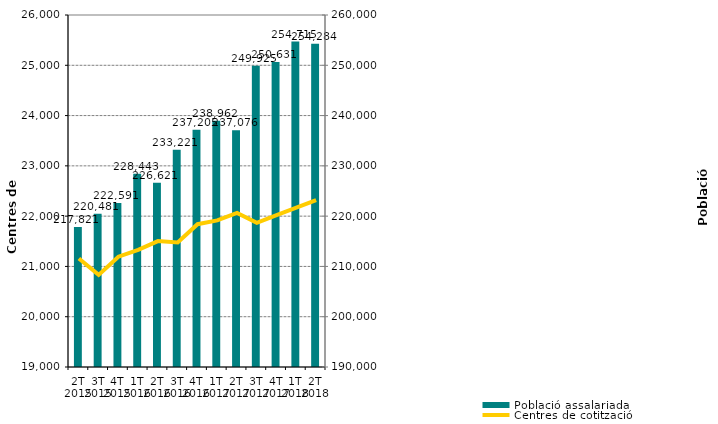
| Category | Població assalariada |
|---|---|
| 2T 2015 | 217821 |
| 3T 2015 | 220481 |
| 4T 2015 | 222591 |
| 1T 2016 | 228443 |
| 2T 2016 | 226621 |
| 3T 2016 | 233221 |
| 4T 2016 | 237205 |
| 1T 2017 | 238962 |
| 2T 2017 | 237076 |
| 3T 2017 | 249925 |
| 4T 2017 | 250631 |
| 1T 2018 | 254715 |
| 2T 2018 | 254284 |